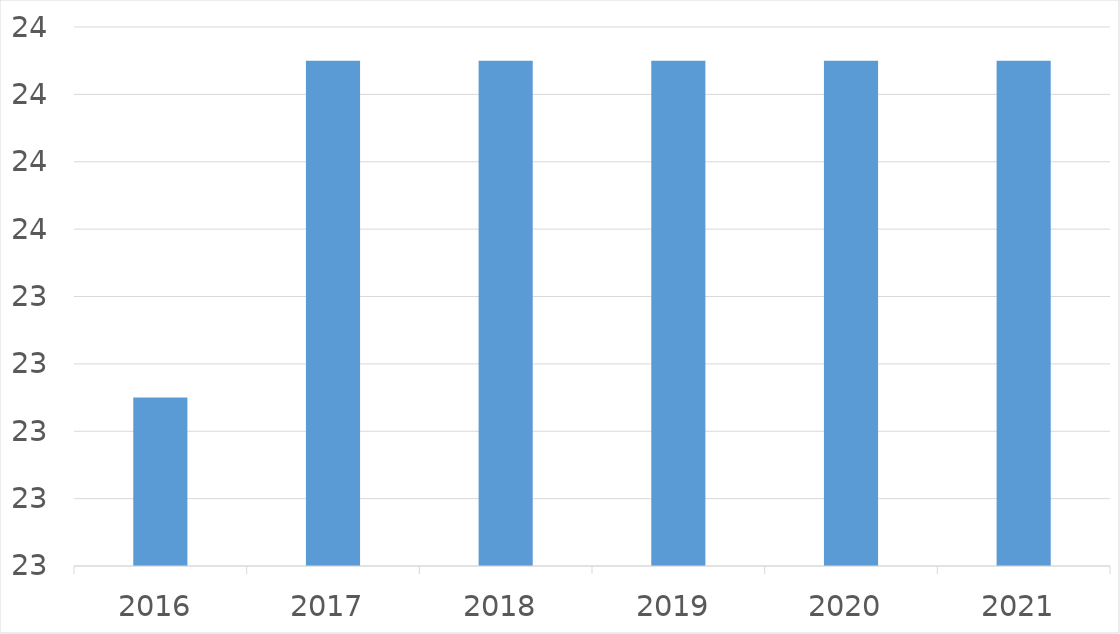
| Category | Series 0 |
|---|---|
| 2016 | 23 |
| 2017 | 24 |
| 2018 | 24 |
| 2019 | 24 |
| 2020 | 24 |
| 2021 | 24 |